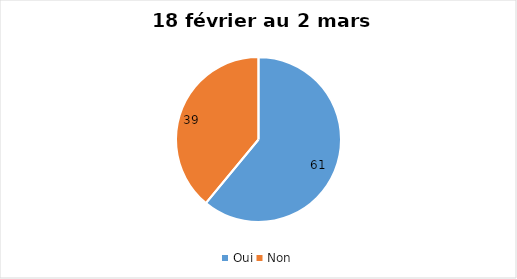
| Category | 18 février au 2 mars 2022 |
|---|---|
| Oui | 61 |
| Non | 39 |